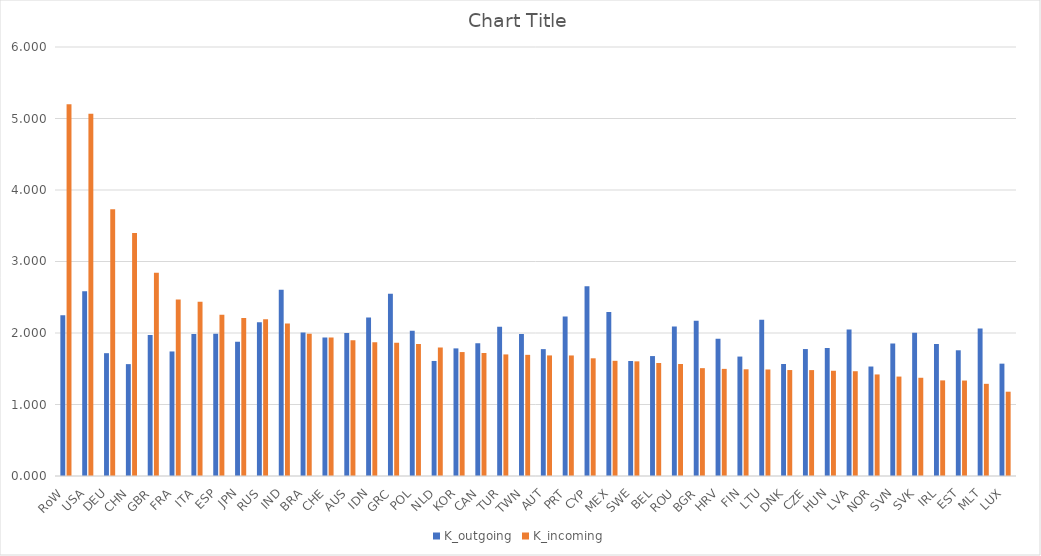
| Category | K_outgoing | K_incoming |
|---|---|---|
| RoW | 2.25 | 5.2 |
| USA | 2.584 | 5.066 |
| DEU | 1.718 | 3.732 |
| CHN | 1.565 | 3.397 |
| GBR | 1.971 | 2.844 |
| FRA | 1.742 | 2.47 |
| ITA | 1.988 | 2.438 |
| ESP | 1.989 | 2.254 |
| JPN | 1.878 | 2.21 |
| RUS | 2.151 | 2.193 |
| IND | 2.606 | 2.133 |
| BRA | 2.008 | 1.989 |
| CHE | 1.937 | 1.939 |
| AUS | 1.999 | 1.899 |
| IDN | 2.215 | 1.871 |
| GRC | 2.547 | 1.864 |
| POL | 2.032 | 1.848 |
| NLD | 1.609 | 1.798 |
| KOR | 1.785 | 1.733 |
| CAN | 1.856 | 1.72 |
| TUR | 2.088 | 1.7 |
| TWN | 1.985 | 1.695 |
| AUT | 1.774 | 1.686 |
| PRT | 2.231 | 1.686 |
| CYP | 2.652 | 1.646 |
| MEX | 2.294 | 1.611 |
| SWE | 1.609 | 1.603 |
| BEL | 1.677 | 1.581 |
| ROU | 2.089 | 1.567 |
| BGR | 2.17 | 1.508 |
| HRV | 1.92 | 1.498 |
| FIN | 1.67 | 1.493 |
| LTU | 2.187 | 1.49 |
| DNK | 1.567 | 1.482 |
| CZE | 1.776 | 1.481 |
| HUN | 1.791 | 1.472 |
| LVA | 2.049 | 1.465 |
| NOR | 1.531 | 1.42 |
| SVN | 1.852 | 1.391 |
| SVK | 2.003 | 1.374 |
| IRL | 1.847 | 1.337 |
| EST | 1.758 | 1.335 |
| MLT | 2.063 | 1.289 |
| LUX | 1.571 | 1.179 |